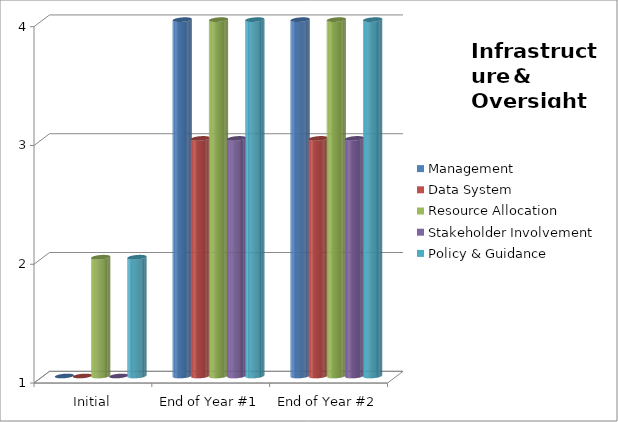
| Category | Management  | Data System  | Resource Allocation  | Stakeholder Involvement  | Policy & Guidance  |
|---|---|---|---|---|---|
| Initial | 1 | 1 | 2 | 1 | 2 |
| End of Year #1 | 4 | 3 | 4 | 3 | 4 |
| End of Year #2 | 4 | 3 | 4 | 3 | 4 |